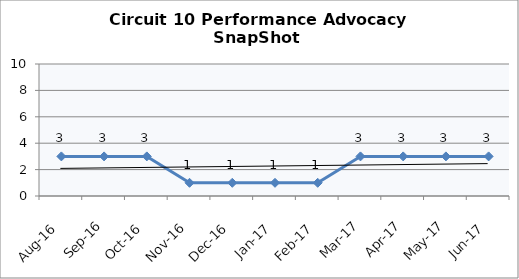
| Category | Circuit 10 |
|---|---|
| Aug-16 | 3 |
| Sep-16 | 3 |
| Oct-16 | 3 |
| Nov-16 | 1 |
| Dec-16 | 1 |
| Jan-17 | 1 |
| Feb-17 | 1 |
| Mar-17 | 3 |
| Apr-17 | 3 |
| May-17 | 3 |
| Jun-17 | 3 |